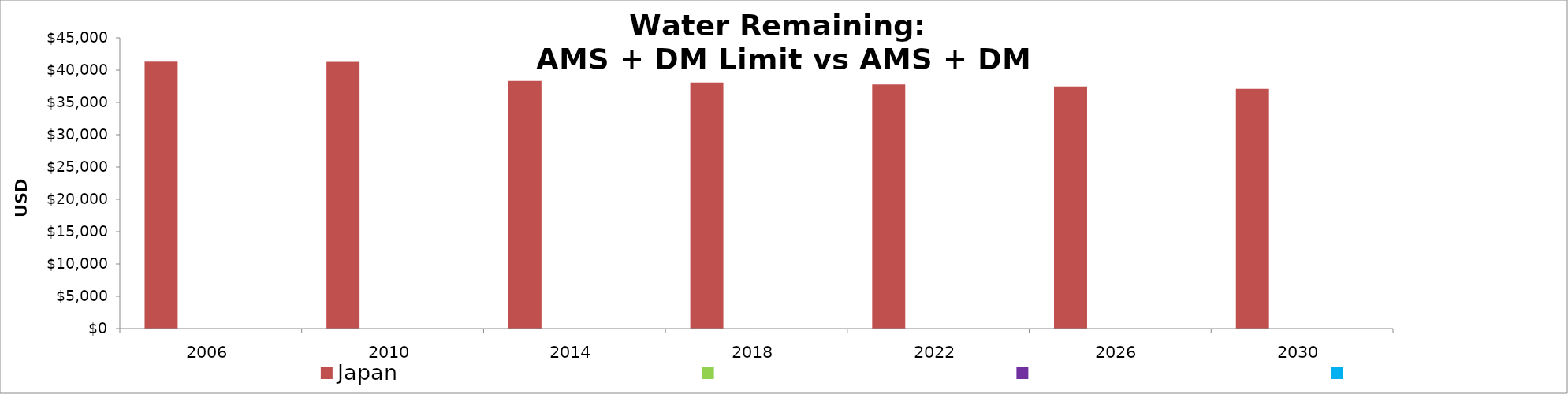
| Category | Japan | Series 3 | Series 4 | Series 0 |
|---|---|---|---|---|
| 2006.0 | 41300605604.134 | 0 | 0 | 0 |
| 2010.0 | 41286452478.08 | 0 | 0 | 0 |
| 2014.0 | 38316750001.8 | 0 | 0 | 0 |
| 2018.0 | 38068111889.504 | 0 | 0 | 0 |
| 2022.0 | 37788267503.612 | 0 | 0 | 0 |
| 2026.0 | 37473300181.862 | 0 | 0 | 0 |
| 2030.0 | 37118801686.371 | 0 | 0 | 0 |